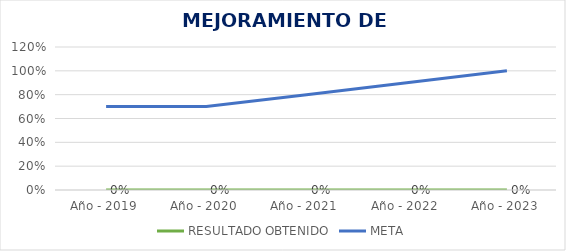
| Category | RESULTADO OBTENIDO | META |
|---|---|---|
| Año - 2019 | 0 | 0.7 |
| Año - 2020 | 0 | 0.7 |
| Año - 2021 | 0 | 0.8 |
| Año - 2022 | 0 | 0.9 |
| Año - 2023 | 0 | 1 |